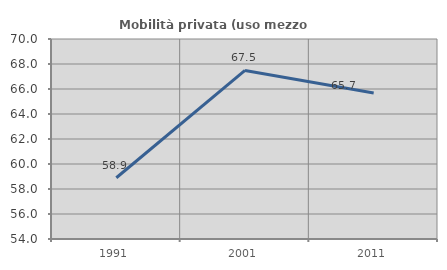
| Category | Mobilità privata (uso mezzo privato) |
|---|---|
| 1991.0 | 58.899 |
| 2001.0 | 67.483 |
| 2011.0 | 65.684 |